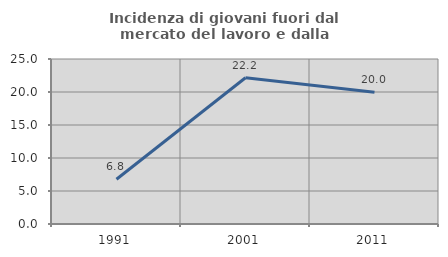
| Category | Incidenza di giovani fuori dal mercato del lavoro e dalla formazione  |
|---|---|
| 1991.0 | 6.777 |
| 2001.0 | 22.161 |
| 2011.0 | 19.969 |